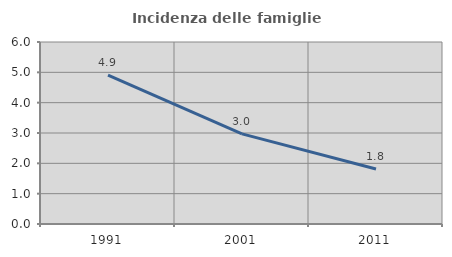
| Category | Incidenza delle famiglie numerose |
|---|---|
| 1991.0 | 4.912 |
| 2001.0 | 2.972 |
| 2011.0 | 1.814 |